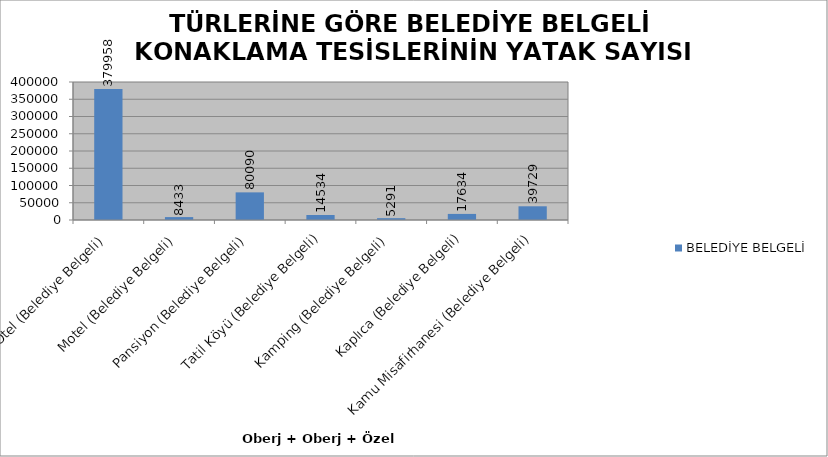
| Category | BELEDİYE BELGELİ |
|---|---|
| Otel (Belediye Belgeli) | 379958 |
| Motel (Belediye Belgeli) | 8433 |
| Pansiyon (Belediye Belgeli) | 80090 |
| Tatil Köyü (Belediye Belgeli) | 14534 |
| Kamping (Belediye Belgeli) | 5291 |
| Kaplıca (Belediye Belgeli) | 17634 |
| Kamu Misafirhanesi (Belediye Belgeli) | 39729 |